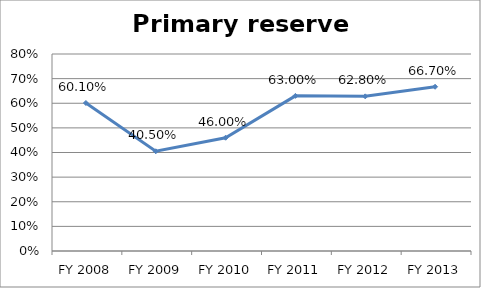
| Category | Primary reserve ratio |
|---|---|
| FY 2013 | 0.667 |
| FY 2012 | 0.628 |
| FY 2011 | 0.63 |
| FY 2010 | 0.46 |
| FY 2009 | 0.405 |
| FY 2008 | 0.601 |